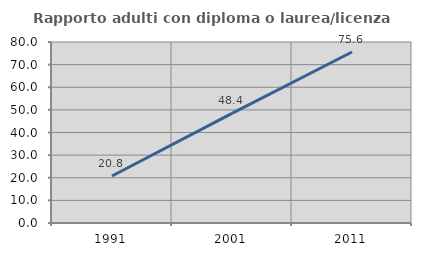
| Category | Rapporto adulti con diploma o laurea/licenza media  |
|---|---|
| 1991.0 | 20.792 |
| 2001.0 | 48.428 |
| 2011.0 | 75.568 |